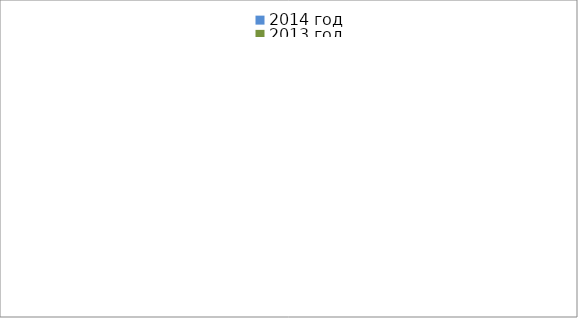
| Category | 2014 год | 2013 год |
|---|---|---|
|  - поджог | 17 | 29 |
|  - неосторожное обращение с огнём | 29 | 42 |
|  - НПТЭ электрооборудования | 16 | 20 |
|  - НПУ и Э печей | 51 | 38 |
|  - НПУ и Э транспортных средств | 48 | 50 |
|   -Шалость с огнем детей | 0 | 3 |
|  -НППБ при эксплуатации эл.приборов | 17 | 21 |
|  - курение | 17 | 10 |
| - прочие | 72 | 64 |
| - не установленные причины | 7 | 1 |